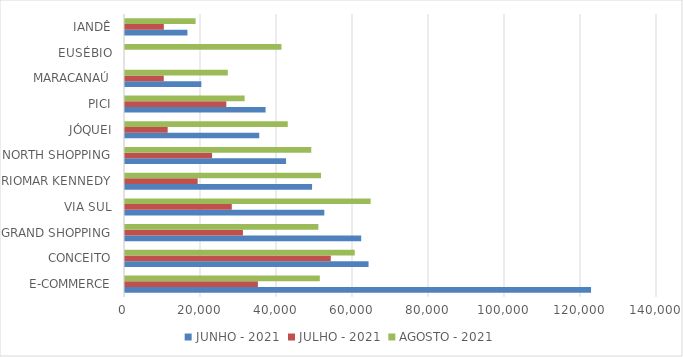
| Category | JUNHO - 2021 | JULHO - 2021 | AGOSTO - 2021 |
|---|---|---|---|
| E-COMMERCE | 122646.712 | 34974.681 | 51269.089 |
| CONCEITO | 64091.304 | 54152.202 | 60449.952 |
| GRAND SHOPPING | 62154.038 | 31039.127 | 50888.754 |
| VIA SUL | 52451.994 | 28105.425 | 64639.743 |
| RIOMAR KENNEDY | 49229.093 | 19123.21 | 51601.211 |
| NORTH SHOPPING | 42384.596 | 22910.515 | 49019.147 |
| JÓQUEI | 35330.849 | 11229.391 | 42829.978 |
| PICI | 36993.324 | 26661.894 | 31475.792 |
| MARACANAÚ | 20088.266 | 10198.632 | 27055.882 |
| EUSÉBIO | 0 | 0 | 41171.792 |
| IANDÊ | 16427.431 | 10223.343 | 18576.111 |